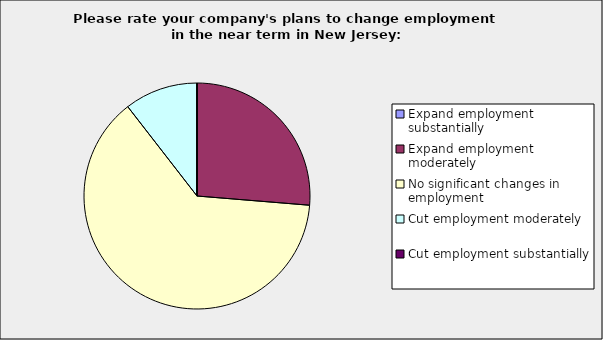
| Category | Series 0 |
|---|---|
| Expand employment substantially | 0 |
| Expand employment moderately | 0.263 |
| No significant changes in employment | 0.632 |
| Cut employment moderately | 0.105 |
| Cut employment substantially | 0 |